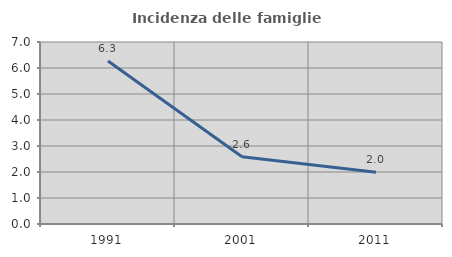
| Category | Incidenza delle famiglie numerose |
|---|---|
| 1991.0 | 6.27 |
| 2001.0 | 2.585 |
| 2011.0 | 1.987 |